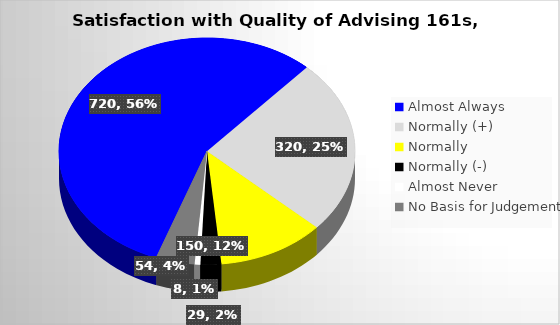
| Category | Series 0 |
|---|---|
| Almost Always | 720 |
| Normally (+) | 320 |
| Normally | 150 |
| Normally (-) | 29 |
| Almost Never | 8 |
| No Basis for Judgement | 54 |